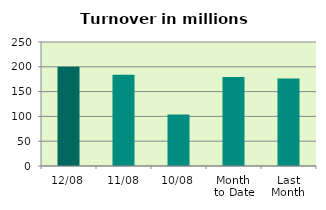
| Category | Series 0 |
|---|---|
| 12/08 | 199.934 |
| 11/08 | 184.144 |
| 10/08 | 103.767 |
| Month 
to Date | 179.621 |
| Last
Month | 176.477 |